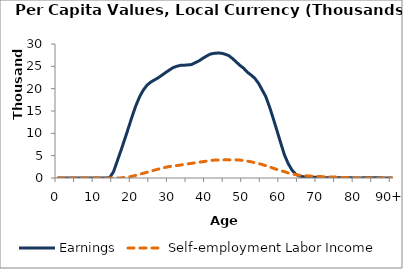
| Category | Earnings | Self-employment Labor Income |
|---|---|---|
| 0 | 0 | 0 |
|  | 0 | 0 |
| 2 | 0 | 0 |
| 3 | 0 | 0 |
| 4 | 0 | 0 |
| 5 | 0 | 0 |
| 6 | 0 | 0 |
| 7 | 0 | 0 |
| 8 | 0 | 0 |
| 9 | 0 | 0 |
| 10 | 0 | 0 |
| 11 | 0 | 0 |
| 12 | 0.157 | 0 |
| 13 | 0 | 0 |
| 14 | 110.244 | 0 |
| 15 | 1432.223 | 0 |
| 16 | 3813.763 | 0 |
| 17 | 6195.304 | 28.552 |
| 18 | 8660.073 | 121.964 |
| 19 | 11208.453 | 238.585 |
| 20 | 13805.759 | 381.551 |
| 21 | 16186.294 | 592.763 |
| 22 | 18181.018 | 821.067 |
| 23 | 19684.637 | 1052.766 |
| 24 | 20777.608 | 1286.809 |
| 25 | 21461.374 | 1517.068 |
| 26 | 21955.044 | 1758.987 |
| 27 | 22426.595 | 1979.803 |
| 28 | 23007.835 | 2189.949 |
| 29 | 23596.688 | 2387.157 |
| 30 | 24165.051 | 2564.908 |
| 31 | 24694.411 | 2676.936 |
| 32 | 25008.64 | 2783.578 |
| 33 | 25220.929 | 2902.589 |
| 34 | 25245.536 | 3029.144 |
| 35 | 25320.885 | 3158.809 |
| 36 | 25395.24 | 3281.577 |
| 37 | 25812.786 | 3412.465 |
| 38 | 26219.383 | 3531.783 |
| 39 | 26784.534 | 3645.554 |
| 40 | 27277.482 | 3775.057 |
| 41 | 27727.148 | 3893.841 |
| 42 | 27897.24 | 3999.821 |
| 43 | 27974.238 | 4022.634 |
| 44 | 27945.737 | 4049.943 |
| 45 | 27721.821 | 4066.816 |
| 46 | 27401.3 | 4059.389 |
| 47 | 26763.86 | 4035.213 |
| 48 | 25998.12 | 4063.802 |
| 49 | 25228.278 | 4017.306 |
| 50 | 24592.984 | 3906.119 |
| 51 | 23690.472 | 3782.805 |
| 52 | 23076.724 | 3625.238 |
| 53 | 22353.448 | 3442.271 |
| 54 | 21239.014 | 3251.368 |
| 55 | 19736.275 | 3025.319 |
| 56 | 18182.91 | 2750.76 |
| 57 | 15890.15 | 2483.278 |
| 58 | 13297.47 | 2195.353 |
| 59 | 10584.859 | 1904.443 |
| 60 | 7833.422 | 1645.048 |
| 61 | 5176.724 | 1412.255 |
| 62 | 3257.968 | 1140.868 |
| 63 | 1808.749 | 928.881 |
| 64 | 884.085 | 749.252 |
| 65 | 436.809 | 609.641 |
| 66 | 287.22 | 512.972 |
| 67 | 175.275 | 481.388 |
| 68 | 163.855 | 426.983 |
| 69 | 166.72 | 382.156 |
| 70 | 130.287 | 338.829 |
| 71 | 101.352 | 312.51 |
| 72 | 76.65 | 267.309 |
| 73 | 54.863 | 240.456 |
| 74 | 38.981 | 216.76 |
| 75 | 49.79 | 196.103 |
| 76 | 45.305 | 144.744 |
| 77 | 40.495 | 114.331 |
| 78 | 35.463 | 83.806 |
| 79 | 29.681 | 55.455 |
| 80 | 23.668 | 27.555 |
| 81 | 25.503 | 19.736 |
| 82 | 27.314 | 12.775 |
| 83 | 29.091 | 9.055 |
| 84 | 28.934 | 5.371 |
| 85 | 28.42 | 2.421 |
| 86 | 28.709 | 0.779 |
| 87 | 29.061 | 0.074 |
| 88 | 18.056 | 0 |
| 89 | 8.422 | 0 |
| 90+ | 0.186 | 0.062 |